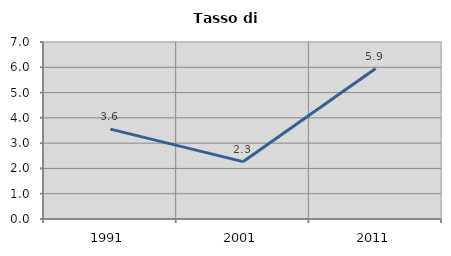
| Category | Tasso di disoccupazione   |
|---|---|
| 1991.0 | 3.553 |
| 2001.0 | 2.268 |
| 2011.0 | 5.949 |